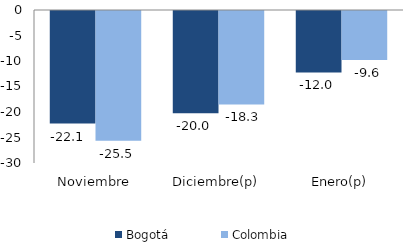
| Category | Bogotá | Colombia |
|---|---|---|
| Noviembre | -22.064 | -25.453 |
| Diciembre(p) | -20.049 | -18.33 |
| Enero(p) | -12.041 | -9.586 |